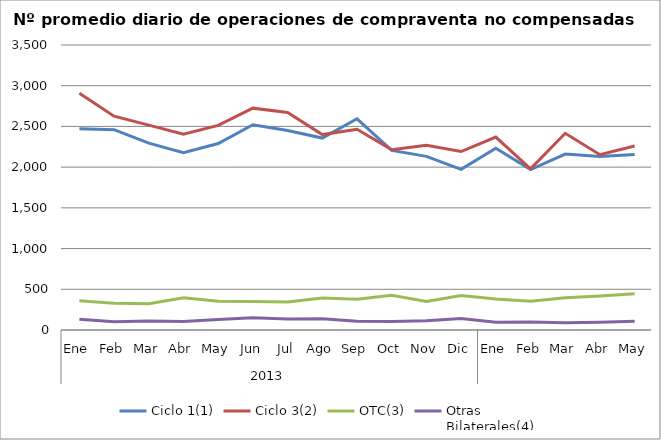
| Category | Ciclo 1(1) | Ciclo 3(2) | OTC(3) | Otras
Bilaterales(4) |
|---|---|---|---|---|
| 0 | 2472.091 | 2907.273 | 357.864 | 131.409 |
| 1 | 2459.8 | 2626.25 | 327.5 | 100.6 |
| 2 | 2294.6 | 2516 | 323.75 | 111.65 |
| 3 | 2176.182 | 2403.364 | 394.818 | 103.364 |
| 4 | 2290.048 | 2512.714 | 352.095 | 130.143 |
| 5 | 2520.75 | 2724.25 | 349.7 | 151.05 |
| 6 | 2449.045 | 2670.182 | 344.818 | 134.5 |
| 7 | 2357.333 | 2400.048 | 392.524 | 137.571 |
| 8 | 2593.778 | 2465 | 376.889 | 108.389 |
| 9 | 2205.955 | 2213.318 | 425.318 | 105.636 |
| 10 | 2132.1 | 2268.1 | 350 | 113.75 |
| 11 | 1972.35 | 2191.55 | 424.35 | 141.55 |
| 12 | 2231.227 | 2368.955 | 379.864 | 95 |
| 13 | 1969.85 | 1978.25 | 352.25 | 97.9 |
| 14 | 2160.619 | 2415.286 | 395.857 | 87.762 |
| 15 | 2130.667 | 2153.048 | 416.143 | 96 |
| 16 | 2155.9 | 2259.8 | 444.8 | 108.2 |